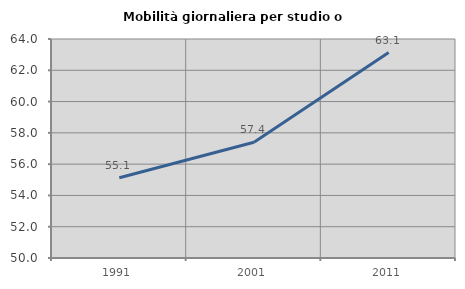
| Category | Mobilità giornaliera per studio o lavoro |
|---|---|
| 1991.0 | 55.132 |
| 2001.0 | 57.397 |
| 2011.0 | 63.133 |